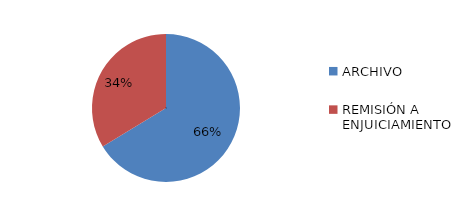
| Category | Series 0 |
|---|---|
| ARCHIVO | 124 |
| REMISIÓN A ENJUICIAMIENTO | 63 |